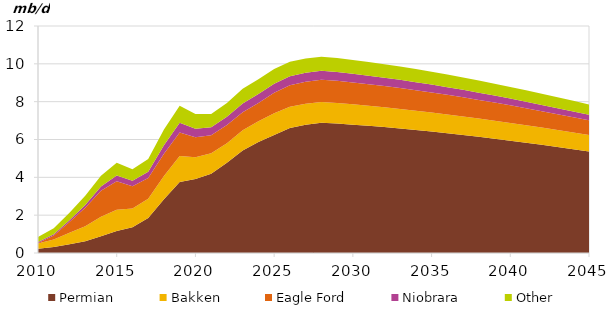
| Category | Permian | Bakken | Eagle Ford | Niobrara | Other |
|---|---|---|---|---|---|
| 2010-01-01 | 0.228 | 0.271 | 0.034 | 0.053 | 0.254 |
| 2011-01-01 | 0.324 | 0.388 | 0.21 | 0.07 | 0.316 |
| 2012-01-01 | 0.469 | 0.601 | 0.565 | 0.099 | 0.391 |
| 2013-01-01 | 0.624 | 0.797 | 0.973 | 0.146 | 0.483 |
| 2014-01-01 | 0.888 | 1.025 | 1.373 | 0.23 | 0.572 |
| 2015-01-01 | 1.162 | 1.127 | 1.5 | 0.309 | 0.678 |
| 2016-01-01 | 1.366 | 0.988 | 1.177 | 0.291 | 0.604 |
| 2017-01-01 | 1.845 | 1.029 | 1.092 | 0.335 | 0.666 |
| 2018-01-01 | 2.844 | 1.222 | 1.187 | 0.445 | 0.824 |
| 2019-01-01 | 3.747 | 1.381 | 1.237 | 0.515 | 0.911 |
| 2020-01-01 | 3.912 | 1.154 | 1.055 | 0.452 | 0.771 |
| 2021-01-01 | 4.191 | 1.079 | 0.96 | 0.413 | 0.701 |
| 2022-01-01 | 4.777 | 1.03 | 0.955 | 0.437 | 0.731 |
| 2023-01-01 | 5.42 | 1.07 | 0.95 | 0.46 | 0.78 |
| 2024-01-01 | 5.87 | 1.1 | 0.96 | 0.47 | 0.78 |
| 2025-01-01 | 6.244 | 1.141 | 1.088 | 0.48 | 0.774 |
| 2026-01-01 | 6.604 | 1.13 | 1.14 | 0.474 | 0.767 |
| 2027-01-01 | 6.777 | 1.116 | 1.165 | 0.466 | 0.76 |
| 2028-01-01 | 6.88 | 1.102 | 1.183 | 0.463 | 0.752 |
| 2029-01-01 | 6.843 | 1.088 | 1.172 | 0.459 | 0.743 |
| 2030-01-01 | 6.786 | 1.074 | 1.158 | 0.454 | 0.734 |
| 2031-01-01 | 6.724 | 1.06 | 1.142 | 0.448 | 0.724 |
| 2032-01-01 | 6.656 | 1.047 | 1.125 | 0.441 | 0.714 |
| 2033-01-01 | 6.583 | 1.033 | 1.105 | 0.433 | 0.704 |
| 2034-01-01 | 6.504 | 1.02 | 1.084 | 0.424 | 0.692 |
| 2035-01-01 | 6.421 | 1.006 | 1.061 | 0.414 | 0.681 |
| 2036-01-01 | 6.333 | 0.993 | 1.037 | 0.404 | 0.669 |
| 2037-01-01 | 6.241 | 0.979 | 1.011 | 0.393 | 0.656 |
| 2038-01-01 | 6.144 | 0.966 | 0.984 | 0.381 | 0.643 |
| 2039-01-01 | 6.043 | 0.953 | 0.956 | 0.369 | 0.63 |
| 2040-01-01 | 5.939 | 0.94 | 0.926 | 0.357 | 0.617 |
| 2041-01-01 | 5.83 | 0.927 | 0.896 | 0.344 | 0.603 |
| 2042-01-01 | 5.719 | 0.914 | 0.866 | 0.33 | 0.589 |
| 2043-01-01 | 5.605 | 0.901 | 0.834 | 0.317 | 0.575 |
| 2044-01-01 | 5.488 | 0.889 | 0.802 | 0.303 | 0.561 |
| 2045-01-01 | 5.368 | 0.876 | 0.77 | 0.289 | 0.546 |